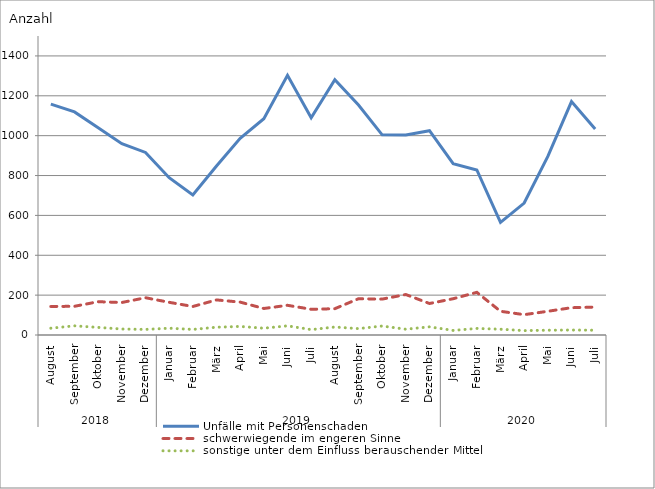
| Category | Unfälle mit Personenschaden | schwerwiegende im engeren Sinne | sonstige unter dem Einfluss berauschender Mittel |
|---|---|---|---|
| 0 | 1158 | 143 | 34 |
| 1 | 1119 | 144 | 46 |
| 2 | 1040 | 167 | 38 |
| 3 | 960 | 163 | 30 |
| 4 | 916 | 187 | 28 |
| 5 | 789 | 164 | 34 |
| 6 | 702 | 143 | 28 |
| 7 | 848 | 176 | 39 |
| 8 | 987 | 165 | 43 |
| 9 | 1085 | 133 | 34 |
| 10 | 1303 | 149 | 46 |
| 11 | 1090 | 129 | 27 |
| 12 | 1281 | 132 | 40 |
| 13 | 1154 | 182 | 32 |
| 14 | 1004 | 180 | 45 |
| 15 | 1003 | 203 | 29 |
| 16 | 1025 | 158 | 41 |
| 17 | 860 | 182 | 23 |
| 18 | 828 | 214 | 33 |
| 19 | 565 | 119 | 29 |
| 20 | 662 | 102 | 22 |
| 21 | 896 | 119 | 24 |
| 22 | 1171 | 137 | 25 |
| 23 | 1033 | 140 | 24 |